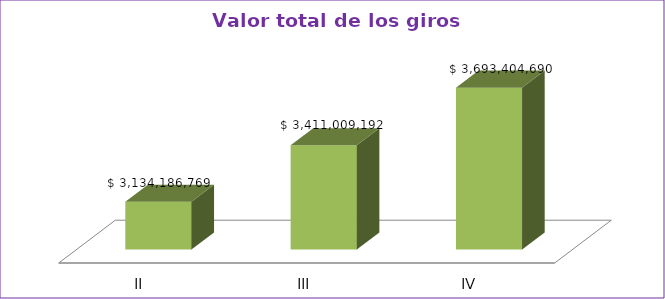
| Category | Series 0 |
|---|---|
| II | 3134186769 |
| III | 3411009192 |
| IV | 3693404690 |